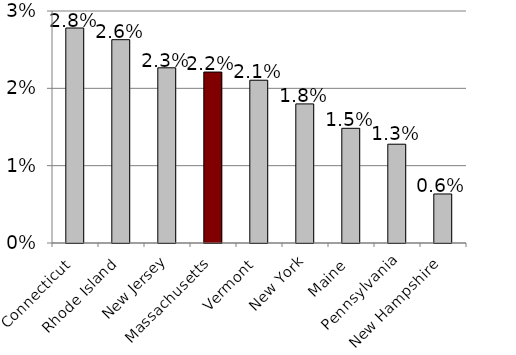
| Category | Series 0 |
|---|---|
| Connecticut | 0.028 |
| Rhode Island | 0.026 |
| New Jersey | 0.023 |
| Massachusetts | 0.022 |
| Vermont | 0.021 |
| New York | 0.018 |
| Maine | 0.015 |
| Pennsylvania | 0.013 |
| New Hampshire | 0.006 |